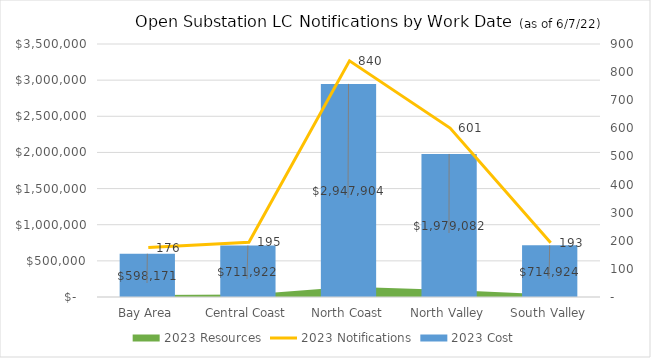
| Category | 2023 Cost |
|---|---|
| Bay Area | 598171.327 |
| Central Coast | 711922.201 |
| North Coast | 2947903.776 |
| North Valley | 1979081.691 |
| South Valley | 714924.205 |